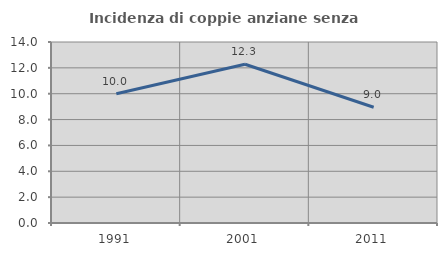
| Category | Incidenza di coppie anziane senza figli  |
|---|---|
| 1991.0 | 10 |
| 2001.0 | 12.281 |
| 2011.0 | 8.955 |